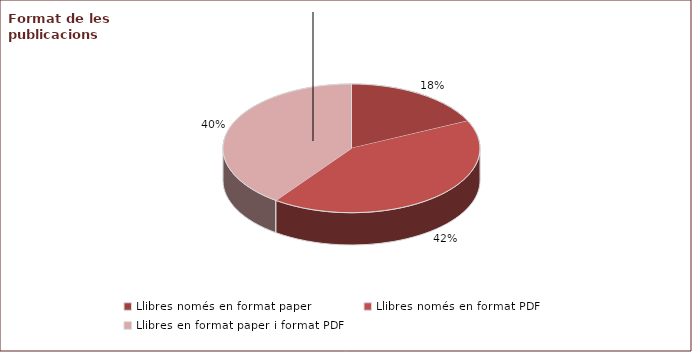
| Category | Series 0 |
|---|---|
| Llibres només en format paper | 0.18 |
| Llibres només en format PDF | 0.42 |
| Llibres en format paper i format PDF | 0.4 |